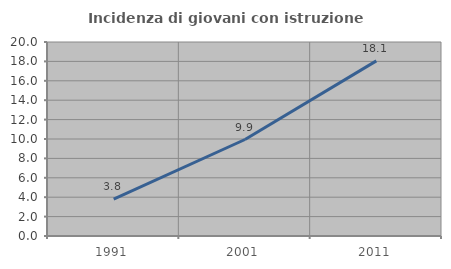
| Category | Incidenza di giovani con istruzione universitaria |
|---|---|
| 1991.0 | 3.804 |
| 2001.0 | 9.948 |
| 2011.0 | 18.052 |